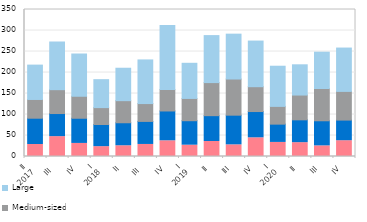
| Category | Micro | Small | Medium-sized | Large |
|---|---|---|---|---|
| II 
2017 | 28.601 | 62.573 | 44.608 | 81.806 |
| III  | 47.306 | 54.987 | 56.8 | 113.518 |
| IV | 31.129 | 59.946 | 52.372 | 100.581 |
| I 
2018 | 23.458 | 52.774 | 40.183 | 66.517 |
| II | 25.544 | 54.802 | 52.603 | 77.229 |
| III  | 28.673 | 54.873 | 42.484 | 103.899 |
| IV | 37.41 | 70.984 | 51.038 | 152.215 |
| I 
2019 | 26.913 | 58.293 | 53.033 | 83.702 |
| II | 35.763 | 61.475 | 78.723 | 111.897 |
| III | 27.759 | 70.634 | 86.103 | 106.825 |
| IV | 44.489 | 62.561 | 59.132 | 108.665 |
| I 
2020 | 33.497 | 43.549 | 42.255 | 95.672 |
| II | 32.96 | 54.335 | 59 | 72.028 |
| III | 25.293 | 59.78 | 76.792 | 86.501 |
| IV | 37.626 | 49.063 | 68.305 | 103.2 |